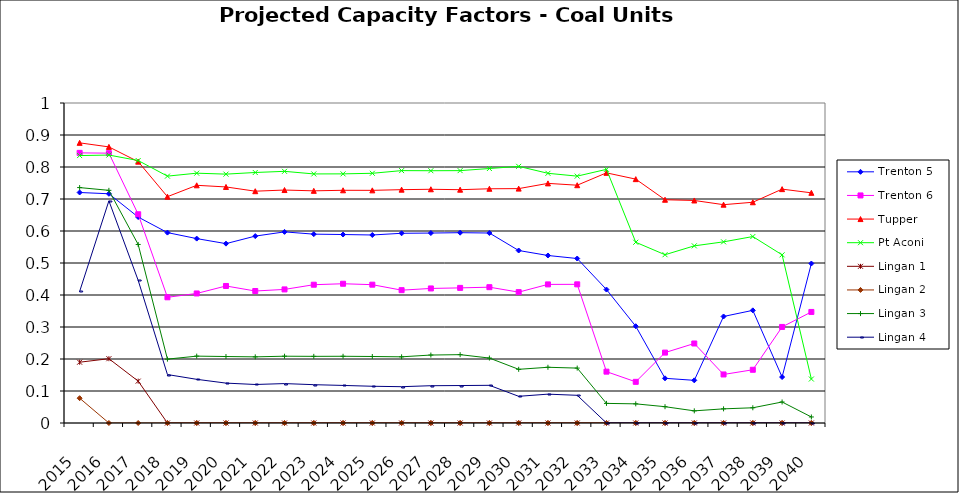
| Category | Trenton 5 | Trenton 6 | Tupper | Pt Aconi | Lingan 1 | Lingan 2 | Lingan 3 | Lingan 4 |
|---|---|---|---|---|---|---|---|---|
| 2015.0 | 0.72 | 0.844 | 0.875 | 0.836 | 0.19 | 0.078 | 0.736 | 0.411 |
| 2016.0 | 0.716 | 0.843 | 0.863 | 0.837 | 0.201 | 0 | 0.727 | 0.694 |
| 2017.0 | 0.644 | 0.652 | 0.817 | 0.82 | 0.131 | 0 | 0.558 | 0.446 |
| 2018.0 | 0.595 | 0.393 | 0.707 | 0.771 | 0 | 0 | 0.2 | 0.151 |
| 2019.0 | 0.576 | 0.405 | 0.743 | 0.781 | 0 | 0 | 0.209 | 0.137 |
| 2020.0 | 0.561 | 0.428 | 0.738 | 0.778 | 0 | 0 | 0.208 | 0.125 |
| 2021.0 | 0.584 | 0.412 | 0.724 | 0.783 | 0 | 0 | 0.207 | 0.12 |
| 2022.0 | 0.597 | 0.417 | 0.728 | 0.786 | 0 | 0 | 0.209 | 0.123 |
| 2023.0 | 0.59 | 0.432 | 0.725 | 0.778 | 0 | 0 | 0.208 | 0.12 |
| 2024.0 | 0.589 | 0.435 | 0.727 | 0.779 | 0 | 0 | 0.209 | 0.117 |
| 2025.0 | 0.588 | 0.432 | 0.727 | 0.78 | 0 | 0 | 0.208 | 0.115 |
| 2026.0 | 0.593 | 0.415 | 0.729 | 0.789 | 0 | 0 | 0.207 | 0.113 |
| 2027.0 | 0.594 | 0.42 | 0.73 | 0.788 | 0 | 0 | 0.212 | 0.117 |
| 2028.0 | 0.595 | 0.422 | 0.729 | 0.789 | 0 | 0 | 0.214 | 0.117 |
| 2029.0 | 0.594 | 0.424 | 0.732 | 0.795 | 0 | 0 | 0.203 | 0.118 |
| 2030.0 | 0.539 | 0.409 | 0.732 | 0.802 | 0 | 0 | 0.168 | 0.083 |
| 2031.0 | 0.523 | 0.433 | 0.749 | 0.78 | 0 | 0 | 0.174 | 0.09 |
| 2032.0 | 0.514 | 0.433 | 0.743 | 0.771 | 0 | 0 | 0.172 | 0.087 |
| 2033.0 | 0.417 | 0.16 | 0.782 | 0.793 | 0 | 0 | 0.061 | 0 |
| 2034.0 | 0.302 | 0.129 | 0.762 | 0.565 | 0 | 0 | 0.06 | 0 |
| 2035.0 | 0.14 | 0.22 | 0.698 | 0.526 | 0 | 0 | 0.051 | 0 |
| 2036.0 | 0.133 | 0.248 | 0.695 | 0.554 | 0 | 0 | 0.038 | 0 |
| 2037.0 | 0.333 | 0.152 | 0.682 | 0.566 | 0 | 0 | 0.044 | 0 |
| 2038.0 | 0.352 | 0.166 | 0.69 | 0.583 | 0 | 0 | 0.048 | 0 |
| 2039.0 | 0.144 | 0.3 | 0.731 | 0.525 | 0 | 0 | 0.066 | 0 |
| 2040.0 | 0.498 | 0.347 | 0.719 | 0.137 | 0 | 0 | 0.019 | 0 |